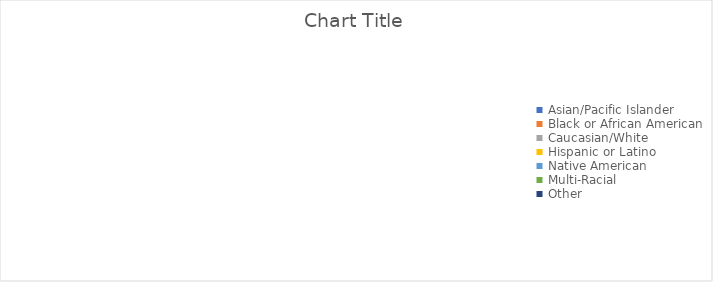
| Category | Series 0 |
|---|---|
| Asian/Pacific Islander | 0 |
| Black or African American | 0 |
| Caucasian/White | 0 |
| Hispanic or Latino | 0 |
| Native American | 0 |
| Multi-Racial | 0 |
| Other | 0 |